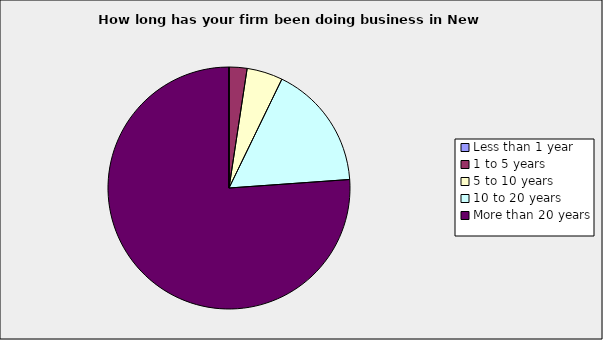
| Category | Series 0 |
|---|---|
| Less than 1 year | 0 |
| 1 to 5 years | 0.024 |
| 5 to 10 years | 0.048 |
| 10 to 20 years | 0.167 |
| More than 20 years | 0.762 |